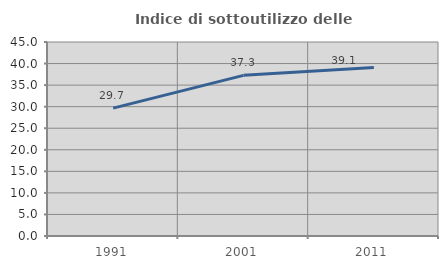
| Category | Indice di sottoutilizzo delle abitazioni  |
|---|---|
| 1991.0 | 29.659 |
| 2001.0 | 37.268 |
| 2011.0 | 39.081 |